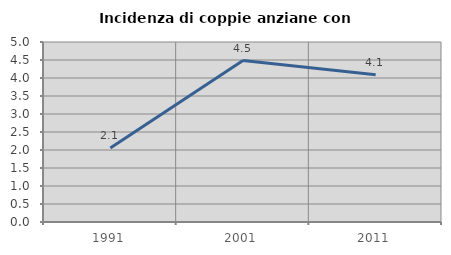
| Category | Incidenza di coppie anziane con figli |
|---|---|
| 1991.0 | 2.052 |
| 2001.0 | 4.485 |
| 2011.0 | 4.091 |